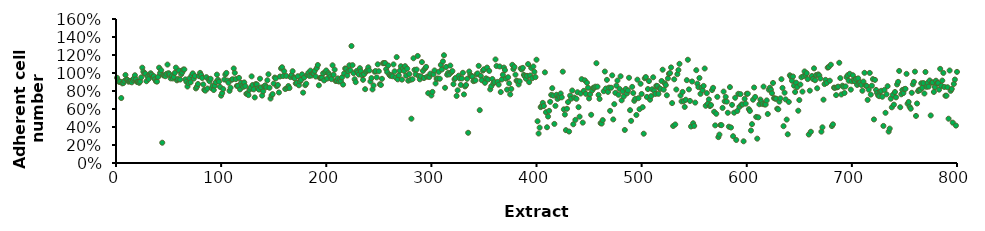
| Category | PC3 |
|---|---|
| 1.0 | 0.946 |
| 2.0 | 0.918 |
| 3.0 | 0.901 |
| 4.0 | 0.904 |
| 5.0 | 0.722 |
| 6.0 | 0.885 |
| 7.0 | 0.888 |
| 8.0 | 0.912 |
| 9.0 | 0.978 |
| 10.0 | 0.929 |
| 11.0 | 0.923 |
| 12.0 | 0.904 |
| 13.0 | 0.909 |
| 14.0 | 0.913 |
| 15.0 | 0.896 |
| 16.0 | 0.925 |
| 17.0 | 0.94 |
| 18.0 | 0.975 |
| 19.0 | 0.93 |
| 20.0 | 0.901 |
| 21.0 | 0.901 |
| 22.0 | 0.891 |
| 23.0 | 0.905 |
| 24.0 | 0.951 |
| 25.0 | 1.059 |
| 26.0 | 1.015 |
| 27.0 | 0.996 |
| 28.0 | 0.992 |
| 29.0 | 0.908 |
| 30.0 | 0.961 |
| 31.0 | 0.933 |
| 32.0 | 0.985 |
| 33.0 | 0.997 |
| 34.0 | 0.98 |
| 35.0 | 0.955 |
| 36.0 | 0.964 |
| 37.0 | 0.93 |
| 38.0 | 0.908 |
| 39.0 | 0.904 |
| 40.0 | 0.956 |
| 41.0 | 1.059 |
| 42.0 | 1 |
| 43.0 | 1.031 |
| 44.0 | 0.225 |
| 45.0 | 0.974 |
| 46.0 | 0.973 |
| 47.0 | 0.964 |
| 48.0 | 0.991 |
| 49.0 | 1.094 |
| 50.0 | 0.999 |
| 51.0 | 0.985 |
| 52.0 | 0.94 |
| 53.0 | 0.964 |
| 54.0 | 0.939 |
| 55.0 | 0.956 |
| 56.0 | 1.001 |
| 57.0 | 1.06 |
| 58.0 | 0.918 |
| 59.0 | 0.932 |
| 60.0 | 1.027 |
| 61.0 | 0.927 |
| 62.0 | 0.986 |
| 63.0 | 1.005 |
| 64.0 | 1.038 |
| 65.0 | 1.039 |
| 66.0 | 0.929 |
| 67.0 | 0.903 |
| 68.0 | 0.85 |
| 69.0 | 0.888 |
| 70.0 | 0.942 |
| 71.0 | 0.896 |
| 72.0 | 0.974 |
| 73.0 | 0.996 |
| 74.0 | 0.938 |
| 75.0 | 0.967 |
| 76.0 | 0.829 |
| 77.0 | 0.846 |
| 78.0 | 0.877 |
| 79.0 | 0.965 |
| 80.0 | 1.001 |
| 81.0 | 0.978 |
| 82.0 | 0.944 |
| 83.0 | 0.873 |
| 84.0 | 0.813 |
| 85.0 | 0.804 |
| 86.0 | 0.954 |
| 87.0 | 0.827 |
| 88.0 | 0.929 |
| 89.0 | 0.908 |
| 90.0 | 0.936 |
| 91.0 | 0.831 |
| 92.0 | 0.859 |
| 93.0 | 0.811 |
| 94.0 | 0.859 |
| 95.0 | 0.898 |
| 96.0 | 0.982 |
| 97.0 | 0.925 |
| 98.0 | 0.904 |
| 99.0 | 0.846 |
| 100.0 | 0.748 |
| 101.0 | 0.776 |
| 102.0 | 0.821 |
| 103.0 | 0.927 |
| 104.0 | 0.982 |
| 105.0 | 1.001 |
| 106.0 | 0.915 |
| 107.0 | 0.892 |
| 108.0 | 0.802 |
| 109.0 | 0.837 |
| 110.0 | 0.925 |
| 111.0 | 0.93 |
| 112.0 | 1.05 |
| 113.0 | 1.002 |
| 114.0 | 0.932 |
| 115.0 | 0.857 |
| 116.0 | 0.857 |
| 117.0 | 0.946 |
| 118.0 | 0.818 |
| 119.0 | 0.89 |
| 120.0 | 0.86 |
| 121.0 | 0.846 |
| 122.0 | 0.895 |
| 123.0 | 0.854 |
| 124.0 | 0.769 |
| 125.0 | 0.773 |
| 126.0 | 0.754 |
| 127.0 | 0.813 |
| 128.0 | 0.838 |
| 129.0 | 0.963 |
| 130.0 | 0.867 |
| 131.0 | 0.818 |
| 132.0 | 0.729 |
| 133.0 | 0.877 |
| 134.0 | 0.873 |
| 135.0 | 0.83 |
| 136.0 | 0.816 |
| 137.0 | 0.937 |
| 138.0 | 0.839 |
| 139.0 | 0.749 |
| 140.0 | 0.796 |
| 141.0 | 0.854 |
| 142.0 | 0.863 |
| 143.0 | 0.842 |
| 144.0 | 0.919 |
| 145.0 | 0.986 |
| 146.0 | 0.836 |
| 147.0 | 0.716 |
| 148.0 | 0.751 |
| 149.0 | 0.765 |
| 150.0 | 0.882 |
| 151.0 | 0.949 |
| 152.0 | 0.94 |
| 153.0 | 0.853 |
| 154.0 | 0.867 |
| 155.0 | 0.784 |
| 156.0 | 0.961 |
| 157.0 | 1.051 |
| 158.0 | 1.064 |
| 159.0 | 0.966 |
| 160.0 | 1.02 |
| 161.0 | 0.822 |
| 162.0 | 0.967 |
| 163.0 | 0.833 |
| 164.0 | 0.855 |
| 165.0 | 0.833 |
| 166.0 | 0.954 |
| 167.0 | 0.978 |
| 168.0 | 1.02 |
| 169.0 | 0.95 |
| 170.0 | 0.942 |
| 171.0 | 0.884 |
| 172.0 | 0.89 |
| 173.0 | 0.964 |
| 174.0 | 0.863 |
| 175.0 | 0.906 |
| 176.0 | 0.922 |
| 177.0 | 0.985 |
| 178.0 | 0.782 |
| 179.0 | 0.95 |
| 180.0 | 0.865 |
| 181.0 | 0.881 |
| 182.0 | 0.978 |
| 183.0 | 1.002 |
| 184.0 | 0.967 |
| 185.0 | 1.026 |
| 186.0 | 0.972 |
| 187.0 | 0.996 |
| 188.0 | 0.998 |
| 189.0 | 1.023 |
| 190.0 | 0.961 |
| 191.0 | 1.055 |
| 192.0 | 1.089 |
| 193.0 | 0.863 |
| 194.0 | 0.945 |
| 195.0 | 0.945 |
| 196.0 | 0.948 |
| 197.0 | 0.996 |
| 198.0 | 0.918 |
| 199.0 | 1.01 |
| 200.0 | 1.028 |
| 201.0 | 0.938 |
| 202.0 | 0.999 |
| 203.0 | 0.983 |
| 204.0 | 0.959 |
| 205.0 | 0.932 |
| 206.0 | 1.086 |
| 207.0 | 0.98 |
| 208.0 | 1.038 |
| 209.0 | 0.911 |
| 210.0 | 0.913 |
| 211.0 | 0.94 |
| 212.0 | 0.905 |
| 213.0 | 0.926 |
| 214.0 | 0.908 |
| 215.0 | 0.951 |
| 216.0 | 0.871 |
| 217.0 | 0.994 |
| 218.0 | 1.05 |
| 219.0 | 1.044 |
| 220.0 | 0.972 |
| 221.0 | 1.02 |
| 222.0 | 1.086 |
| 223.0 | 1.03 |
| 224.0 | 1.3 |
| 225.0 | 1.087 |
| 226.0 | 0.998 |
| 227.0 | 0.93 |
| 228.0 | 0.898 |
| 229.0 | 1.023 |
| 230.0 | 1.006 |
| 231.0 | 0.983 |
| 232.0 | 1.054 |
| 233.0 | 1.018 |
| 234.0 | 0.975 |
| 235.0 | 0.924 |
| 236.0 | 0.986 |
| 237.0 | 0.82 |
| 238.0 | 1.015 |
| 239.0 | 1.03 |
| 240.0 | 1.063 |
| 241.0 | 1.028 |
| 242.0 | 0.906 |
| 243.0 | 0.943 |
| 244.0 | 0.818 |
| 245.0 | 0.861 |
| 246.0 | 1.014 |
| 247.0 | 1.021 |
| 248.0 | 0.951 |
| 249.0 | 1.097 |
| 250.0 | 1.019 |
| 251.0 | 0.875 |
| 252.0 | 0.867 |
| 253.0 | 0.935 |
| 254.0 | 1.108 |
| 255.0 | 1.11 |
| 256.0 | 1.11 |
| 257.0 | 1.043 |
| 258.0 | 1.01 |
| 259.0 | 1.084 |
| 260.0 | 0.98 |
| 261.0 | 0.968 |
| 262.0 | 0.977 |
| 263.0 | 0.964 |
| 264.0 | 1.096 |
| 265.0 | 1.018 |
| 266.0 | 0.951 |
| 267.0 | 1.177 |
| 268.0 | 0.929 |
| 269.0 | 0.975 |
| 270.0 | 1.025 |
| 271.0 | 1.075 |
| 272.0 | 0.926 |
| 273.0 | 1.049 |
| 274.0 | 1.023 |
| 275.0 | 1.076 |
| 276.0 | 0.971 |
| 277.0 | 1.048 |
| 278.0 | 0.915 |
| 279.0 | 0.989 |
| 280.0 | 0.924 |
| 281.0 | 0.492 |
| 282.0 | 0.93 |
| 283.0 | 1.164 |
| 284.0 | 1.035 |
| 285.0 | 0.986 |
| 286.0 | 1.038 |
| 287.0 | 1.189 |
| 288.0 | 0.966 |
| 289.0 | 0.929 |
| 290.0 | 0.963 |
| 291.0 | 1.121 |
| 292.0 | 1.023 |
| 293.0 | 0.944 |
| 294.0 | 1.051 |
| 295.0 | 1.068 |
| 296.0 | 0.959 |
| 297.0 | 0.776 |
| 298.0 | 0.955 |
| 299.0 | 0.993 |
| 300.0 | 0.75 |
| 301.0 | 0.79 |
| 302.0 | 0.986 |
| 303.0 | 1.028 |
| 304.0 | 0.884 |
| 305.0 | 0.934 |
| 306.0 | 0.939 |
| 307.0 | 1.012 |
| 308.0 | 0.936 |
| 309.0 | 1.09 |
| 310.0 | 1.039 |
| 311.0 | 1.129 |
| 312.0 | 1.197 |
| 313.0 | 0.835 |
| 314.0 | 1.067 |
| 315.0 | 0.981 |
| 316.0 | 1.003 |
| 317.0 | 0.985 |
| 318.0 | 1.083 |
| 319.0 | 1.008 |
| 320.0 | 1.021 |
| 321.0 | 0.876 |
| 322.0 | 0.93 |
| 323.0 | 0.945 |
| 324.0 | 0.745 |
| 325.0 | 0.808 |
| 326.0 | 0.97 |
| 327.0 | 0.939 |
| 328.0 | 0.867 |
| 329.0 | 0.939 |
| 330.0 | 1.002 |
| 331.0 | 0.762 |
| 332.0 | 0.851 |
| 333.0 | 0.866 |
| 334.0 | 0.935 |
| 335.0 | 0.336 |
| 336.0 | 1.017 |
| 337.0 | 0.98 |
| 338.0 | 0.964 |
| 339.0 | 0.96 |
| 340.0 | 0.91 |
| 341.0 | 0.917 |
| 342.0 | 0.918 |
| 343.0 | 0.986 |
| 344.0 | 0.995 |
| 345.0 | 1.08 |
| 346.0 | 0.587 |
| 347.0 | 0.967 |
| 348.0 | 0.92 |
| 349.0 | 1.027 |
| 350.0 | 1.04 |
| 351.0 | 0.891 |
| 352.0 | 0.941 |
| 353.0 | 1.06 |
| 354.0 | 0.928 |
| 355.0 | 1.023 |
| 356.0 | 0.818 |
| 357.0 | 0.853 |
| 358.0 | 0.933 |
| 359.0 | 0.885 |
| 360.0 | 0.899 |
| 361.0 | 1.151 |
| 362.0 | 1.078 |
| 363.0 | 0.901 |
| 364.0 | 0.87 |
| 365.0 | 1.072 |
| 366.0 | 0.788 |
| 367.0 | 0.928 |
| 368.0 | 0.98 |
| 369.0 | 1.06 |
| 370.0 | 1.032 |
| 371.0 | 0.937 |
| 372.0 | 0.815 |
| 373.0 | 0.953 |
| 374.0 | 0.885 |
| 375.0 | 0.762 |
| 376.0 | 0.823 |
| 377.0 | 1.091 |
| 378.0 | 1.044 |
| 379.0 | 1.067 |
| 380.0 | 0.982 |
| 381.0 | 0.915 |
| 382.0 | 0.908 |
| 383.0 | 0.873 |
| 384.0 | 0.908 |
| 385.0 | 1.049 |
| 386.0 | 1.039 |
| 387.0 | 1.057 |
| 388.0 | 0.979 |
| 389.0 | 0.963 |
| 390.0 | 0.936 |
| 391.0 | 0.968 |
| 392.0 | 1.099 |
| 393.0 | 0.898 |
| 394.0 | 0.972 |
| 395.0 | 1.056 |
| 396.0 | 0.943 |
| 397.0 | 1.072 |
| 398.0 | 1.013 |
| 399.0 | 0.954 |
| 400.0 | 1.148 |
| 401.0 | 0.464 |
| 402.0 | 0.328 |
| 403.0 | 0.393 |
| 404.0 | 0.621 |
| 405.0 | 0.632 |
| 406.0 | 0.668 |
| 407.0 | 0.633 |
| 408.0 | 1.007 |
| 409.0 | 0.564 |
| 410.0 | 0.397 |
| 411.0 | 0.516 |
| 412.0 | 0.579 |
| 413.0 | 0.68 |
| 414.0 | 0.757 |
| 415.0 | 0.831 |
| 416.0 | 0.749 |
| 417.0 | 0.434 |
| 418.0 | 0.635 |
| 419.0 | 0.758 |
| 420.0 | 0.712 |
| 421.0 | 0.74 |
| 422.0 | 0.728 |
| 423.0 | 0.772 |
| 424.0 | 0.73 |
| 425.0 | 1.015 |
| 426.0 | 0.596 |
| 427.0 | 0.538 |
| 428.0 | 0.365 |
| 429.0 | 0.603 |
| 430.0 | 0.677 |
| 431.0 | 0.349 |
| 432.0 | 0.749 |
| 433.0 | 0.714 |
| 434.0 | 0.806 |
| 435.0 | 0.43 |
| 436.0 | 0.727 |
| 437.0 | 0.479 |
| 438.0 | 0.713 |
| 439.0 | 0.786 |
| 440.0 | 0.621 |
| 441.0 | 0.515 |
| 442.0 | 0.772 |
| 443.0 | 0.931 |
| 444.0 | 0.448 |
| 445.0 | 0.802 |
| 446.0 | 0.919 |
| 447.0 | 0.768 |
| 448.0 | 0.892 |
| 449.0 | 0.836 |
| 450.0 | 0.717 |
| 451.0 | 0.764 |
| 452.0 | 0.536 |
| 453.0 | 0.807 |
| 454.0 | 0.836 |
| 455.0 | 0.836 |
| 456.0 | 0.848 |
| 457.0 | 1.109 |
| 458.0 | 0.848 |
| 459.0 | 0.757 |
| 460.0 | 0.712 |
| 461.0 | 0.443 |
| 462.0 | 0.438 |
| 463.0 | 0.477 |
| 464.0 | 0.798 |
| 465.0 | 1.016 |
| 466.0 | 0.827 |
| 467.0 | 0.924 |
| 468.0 | 0.79 |
| 469.0 | 0.838 |
| 470.0 | 0.579 |
| 471.0 | 0.836 |
| 472.0 | 0.974 |
| 473.0 | 0.484 |
| 474.0 | 0.654 |
| 475.0 | 0.78 |
| 476.0 | 0.859 |
| 477.0 | 0.916 |
| 478.0 | 0.758 |
| 479.0 | 0.824 |
| 480.0 | 0.964 |
| 481.0 | 0.696 |
| 482.0 | 0.798 |
| 483.0 | 0.739 |
| 484.0 | 0.367 |
| 485.0 | 0.823 |
| 486.0 | 0.772 |
| 487.0 | 0.806 |
| 488.0 | 0.947 |
| 489.0 | 0.587 |
| 490.0 | 0.468 |
| 491.0 | 0.846 |
| 492.0 | 0.778 |
| 493.0 | 0.691 |
| 494.0 | 0.714 |
| 495.0 | 0.534 |
| 496.0 | 0.926 |
| 497.0 | 0.72 |
| 498.0 | 0.598 |
| 499.0 | 0.88 |
| 500.0 | 0.767 |
| 501.0 | 0.62 |
| 502.0 | 0.325 |
| 503.0 | 0.942 |
| 504.0 | 0.955 |
| 505.0 | 0.734 |
| 506.0 | 0.822 |
| 507.0 | 0.91 |
| 508.0 | 0.703 |
| 509.0 | 0.743 |
| 510.0 | 0.819 |
| 511.0 | 0.952 |
| 512.0 | 0.803 |
| 513.0 | 0.767 |
| 514.0 | 0.858 |
| 515.0 | 0.855 |
| 516.0 | 0.768 |
| 517.0 | 0.83 |
| 518.0 | 0.823 |
| 519.0 | 0.911 |
| 520.0 | 1.037 |
| 521.0 | 0.815 |
| 522.0 | 0.886 |
| 523.0 | 0.866 |
| 524.0 | 0.752 |
| 525.0 | 0.94 |
| 526.0 | 0.991 |
| 527.0 | 0.999 |
| 528.0 | 1.062 |
| 529.0 | 0.666 |
| 530.0 | 0.411 |
| 531.0 | 0.93 |
| 532.0 | 0.428 |
| 533.0 | 0.816 |
| 534.0 | 0.987 |
| 535.0 | 1.033 |
| 536.0 | 1.102 |
| 537.0 | 0.75 |
| 538.0 | 0.684 |
| 539.0 | 0.79 |
| 540.0 | 0.687 |
| 541.0 | 0.623 |
| 542.0 | 0.703 |
| 543.0 | 0.92 |
| 544.0 | 1.147 |
| 545.0 | 0.818 |
| 546.0 | 0.69 |
| 547.0 | 0.406 |
| 548.0 | 0.906 |
| 549.0 | 0.442 |
| 550.0 | 0.412 |
| 551.0 | 0.671 |
| 552.0 | 1.031 |
| 553.0 | 0.882 |
| 554.0 | 0.843 |
| 555.0 | 0.944 |
| 556.0 | 0.768 |
| 557.0 | 0.836 |
| 558.0 | 0.807 |
| 559.0 | 0.856 |
| 560.0 | 1.05 |
| 561.0 | 0.636 |
| 562.0 | 0.777 |
| 563.0 | 0.659 |
| 564.0 | 0.707 |
| 565.0 | 0.632 |
| 566.0 | 0.644 |
| 567.0 | 0.81 |
| 568.0 | 0.835 |
| 569.0 | 0.569 |
| 570.0 | 0.418 |
| 571.0 | 0.547 |
| 572.0 | 0.735 |
| 573.0 | 0.287 |
| 574.0 | 0.316 |
| 575.0 | 0.422 |
| 576.0 | 0.42 |
| 577.0 | 0.612 |
| 578.0 | 0.794 |
| 579.0 | 0.685 |
| 580.0 | 0.735 |
| 581.0 | 0.682 |
| 582.0 | 0.558 |
| 583.0 | 0.404 |
| 584.0 | 0.843 |
| 585.0 | 0.395 |
| 586.0 | 0.646 |
| 587.0 | 0.298 |
| 588.0 | 0.559 |
| 589.0 | 0.725 |
| 590.0 | 0.256 |
| 591.0 | 0.578 |
| 592.0 | 0.769 |
| 593.0 | 0.623 |
| 594.0 | 0.765 |
| 595.0 | 0.649 |
| 596.0 | 0.65 |
| 597.0 | 0.241 |
| 598.0 | 0.712 |
| 599.0 | 0.659 |
| 600.0 | 0.769 |
| 601.0 | 0.77 |
| 602.0 | 0.599 |
| 603.0 | 0.578 |
| 604.0 | 0.361 |
| 605.0 | 0.432 |
| 606.0 | 0.703 |
| 607.0 | 0.839 |
| 608.0 | 0.734 |
| 609.0 | 0.512 |
| 610.0 | 0.271 |
| 611.0 | 0.507 |
| 612.0 | 0.653 |
| 613.0 | 0.705 |
| 614.0 | 0.677 |
| 615.0 | 0.655 |
| 616.0 | 0.849 |
| 617.0 | 0.65 |
| 618.0 | 0.65 |
| 619.0 | 0.696 |
| 620.0 | 0.544 |
| 621.0 | 0.814 |
| 622.0 | 0.836 |
| 623.0 | 0.814 |
| 624.0 | 0.776 |
| 625.0 | 0.889 |
| 626.0 | 0.72 |
| 627.0 | 0.715 |
| 628.0 | 0.715 |
| 629.0 | 0.603 |
| 630.0 | 0.596 |
| 631.0 | 0.682 |
| 632.0 | 0.718 |
| 633.0 | 0.931 |
| 634.0 | 0.834 |
| 635.0 | 0.409 |
| 636.0 | 0.781 |
| 637.0 | 0.707 |
| 638.0 | 0.482 |
| 639.0 | 0.319 |
| 640.0 | 0.679 |
| 641.0 | 0.975 |
| 642.0 | 0.958 |
| 643.0 | 0.914 |
| 644.0 | 0.961 |
| 645.0 | 0.859 |
| 646.0 | 0.789 |
| 647.0 | 0.892 |
| 648.0 | 0.844 |
| 649.0 | 0.581 |
| 650.0 | 0.699 |
| 651.0 | 0.871 |
| 652.0 | 0.953 |
| 653.0 | 0.793 |
| 654.0 | 0.965 |
| 655.0 | 1.017 |
| 656.0 | 0.979 |
| 657.0 | 0.998 |
| 658.0 | 0.932 |
| 659.0 | 0.317 |
| 660.0 | 0.804 |
| 661.0 | 0.347 |
| 662.0 | 0.966 |
| 663.0 | 0.933 |
| 664.0 | 1.052 |
| 665.0 | 0.92 |
| 666.0 | 0.977 |
| 667.0 | 0.83 |
| 668.0 | 0.984 |
| 669.0 | 0.973 |
| 670.0 | 0.939 |
| 671.0 | 0.348 |
| 672.0 | 0.396 |
| 673.0 | 0.703 |
| 674.0 | 0.877 |
| 675.0 | 0.924 |
| 676.0 | 0.889 |
| 677.0 | 1.06 |
| 678.0 | 1.067 |
| 679.0 | 0.914 |
| 680.0 | 1.092 |
| 681.0 | 0.41 |
| 682.0 | 0.43 |
| 683.0 | 0.837 |
| 684.0 | 0.836 |
| 685.0 | 0.754 |
| 686.0 | 0.841 |
| 687.0 | 0.848 |
| 688.0 | 1.114 |
| 689.0 | 0.943 |
| 690.0 | 0.761 |
| 691.0 | 0.859 |
| 692.0 | 0.847 |
| 693.0 | 0.778 |
| 694.0 | 0.851 |
| 695.0 | 0.954 |
| 696.0 | 0.975 |
| 697.0 | 0.914 |
| 698.0 | 0.991 |
| 699.0 | 0.815 |
| 700.0 | 0.909 |
| 701.0 | 0.975 |
| 702.0 | 0.918 |
| 703.0 | 0.904 |
| 704.0 | 0.935 |
| 705.0 | 0.867 |
| 706.0 | 0.94 |
| 707.0 | 0.882 |
| 708.0 | 0.896 |
| 709.0 | 0.867 |
| 710.0 | 0.803 |
| 711.0 | 0.904 |
| 712.0 | 1.002 |
| 713.0 | 0.86 |
| 714.0 | 0.856 |
| 715.0 | 0.701 |
| 716.0 | 0.815 |
| 717.0 | 1.001 |
| 718.0 | 0.76 |
| 719.0 | 0.859 |
| 720.0 | 0.932 |
| 721.0 | 0.484 |
| 722.0 | 0.923 |
| 723.0 | 0.812 |
| 724.0 | 0.777 |
| 725.0 | 0.752 |
| 726.0 | 0.743 |
| 727.0 | 0.793 |
| 728.0 | 0.802 |
| 729.0 | 0.736 |
| 730.0 | 0.412 |
| 731.0 | 0.812 |
| 732.0 | 0.558 |
| 733.0 | 0.763 |
| 734.0 | 0.854 |
| 735.0 | 0.349 |
| 736.0 | 0.382 |
| 737.0 | 0.714 |
| 738.0 | 0.619 |
| 739.0 | 0.758 |
| 740.0 | 0.648 |
| 741.0 | 0.789 |
| 742.0 | 0.73 |
| 743.0 | 0.873 |
| 744.0 | 0.901 |
| 745.0 | 1.023 |
| 746.0 | 0.62 |
| 747.0 | 0.763 |
| 748.0 | 0.811 |
| 749.0 | 0.777 |
| 750.0 | 0.821 |
| 751.0 | 0.824 |
| 752.0 | 0.99 |
| 753.0 | 0.659 |
| 754.0 | 0.678 |
| 755.0 | 0.624 |
| 756.0 | 0.603 |
| 757.0 | 0.78 |
| 758.0 | 0.874 |
| 759.0 | 0.901 |
| 760.0 | 1.015 |
| 761.0 | 0.523 |
| 762.0 | 0.661 |
| 763.0 | 0.799 |
| 764.0 | 0.814 |
| 765.0 | 0.812 |
| 766.0 | 0.886 |
| 767.0 | 0.836 |
| 768.0 | 0.888 |
| 769.0 | 0.772 |
| 770.0 | 1.011 |
| 771.0 | 0.846 |
| 772.0 | 0.89 |
| 773.0 | 0.848 |
| 774.0 | 0.917 |
| 775.0 | 0.528 |
| 776.0 | 0.892 |
| 777.0 | 0.895 |
| 778.0 | 0.789 |
| 779.0 | 0.843 |
| 780.0 | 0.914 |
| 781.0 | 0.885 |
| 782.0 | 0.888 |
| 783.0 | 0.815 |
| 784.0 | 1.046 |
| 785.0 | 0.859 |
| 786.0 | 0.916 |
| 787.0 | 1.001 |
| 788.0 | 0.845 |
| 789.0 | 0.748 |
| 790.0 | 0.748 |
| 791.0 | 0.842 |
| 792.0 | 0.492 |
| 793.0 | 1.028 |
| 794.0 | 0.802 |
| 795.0 | 0.823 |
| 796.0 | 0.448 |
| 797.0 | 0.878 |
| 798.0 | 0.927 |
| 799.0 | 0.416 |
| 800.0 | 1.012 |